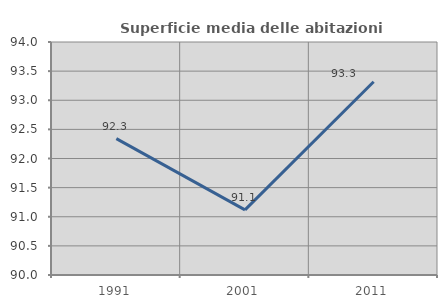
| Category | Superficie media delle abitazioni occupate |
|---|---|
| 1991.0 | 92.341 |
| 2001.0 | 91.119 |
| 2011.0 | 93.319 |